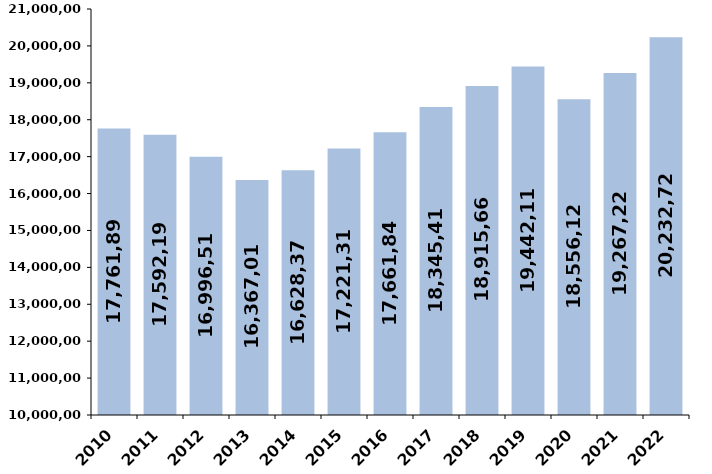
| Category | % de variación
 interanual |
|---|---|
| 2010 | 17761897.38 |
| 2011 | 17592190.68 |
| 2012 | 16996510.36 |
| 2013 | 16367012.59 |
| 2014 | 16628373.23 |
| 2015 | 17221310.4 |
| 2016 | 17661839.56 |
| 2017 | 18345414.19 |
| 2018 | 18915667.81 |
| 2019 | 19442113.455 |
| 2020 | 18556129 |
| 2021 | 19267221 |
| 2022 | 20232723.136 |